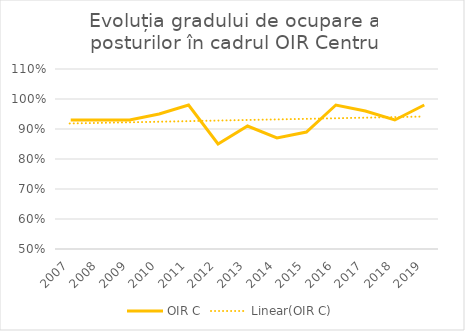
| Category | OIR C |
|---|---|
| 2007.0 | 0.93 |
| 2008.0 | 0.93 |
| 2009.0 | 0.93 |
| 2010.0 | 0.95 |
| 2011.0 | 0.98 |
| 2012.0 | 0.85 |
| 2013.0 | 0.91 |
| 2014.0 | 0.87 |
| 2015.0 | 0.89 |
| 2016.0 | 0.98 |
| 2017.0 | 0.96 |
| 2018.0 | 0.93 |
| 2019.0 | 0.98 |